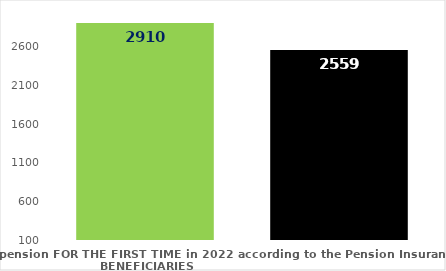
| Category | broj korisnika |
|---|---|
| Pension beneficiaries entitled to pension FOR THE FIRST TIME in 2022 according to the Pension Insurance Act  - NEW BENEFICIARIES | 2910 |
| Pension beneficiaries whose pension entitlement ceased in 2022  -  death caused,   
and who were retired according to the Pension Insurance Act   | 2559 |